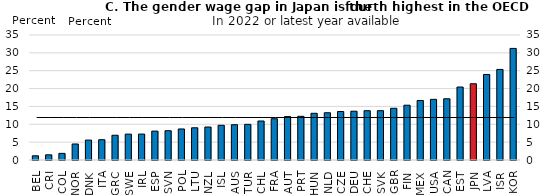
| Category | Gender wage gap at median, 2021 or latest available value |
|---|---|
| BEL | 1.173 |
| CRI | 1.449 |
| COL | 1.859 |
| NOR | 4.481 |
| DNK | 5.576 |
| ITA | 5.678 |
| GRC | 6.932 |
| SWE | 7.246 |
| IRL | 7.258 |
| ESP | 8.094 |
| SVN | 8.195 |
| POL | 8.691 |
| LTU | 9.021 |
| NZL | 9.238 |
| ISL | 9.723 |
| AUS | 9.875 |
| TUR | 9.981 |
| CHL | 10.919 |
| FRA | 11.558 |
| AUT | 12.157 |
| PRT | 12.231 |
| HUN | 13.077 |
| NLD | 13.231 |
| CZE | 13.576 |
| DEU | 13.659 |
| CHE | 13.803 |
| SVK | 13.808 |
| GBR | 14.48 |
| FIN | 15.341 |
| MEX | 16.667 |
| USA | 16.984 |
| CAN | 17.143 |
| EST | 20.43 |
| JPN | 21.348 |
| LVA | 23.953 |
| ISR | 25.358 |
| KOR | 31.242 |